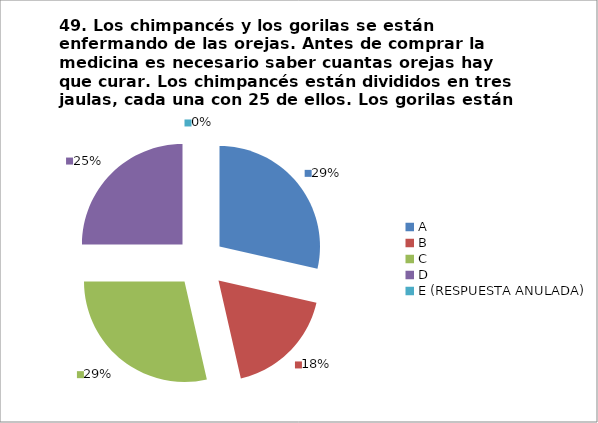
| Category | CANTIDAD DE RESPUESTAS PREGUNTA (49) | PORCENTAJE |
|---|---|---|
| A | 8 | 0.286 |
| B | 5 | 0.179 |
| C | 8 | 0.286 |
| D | 7 | 0.25 |
| E (RESPUESTA ANULADA) | 0 | 0 |